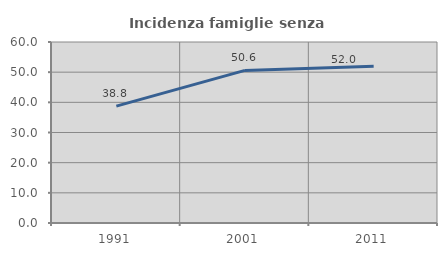
| Category | Incidenza famiglie senza nuclei |
|---|---|
| 1991.0 | 38.756 |
| 2001.0 | 50.588 |
| 2011.0 | 51.969 |